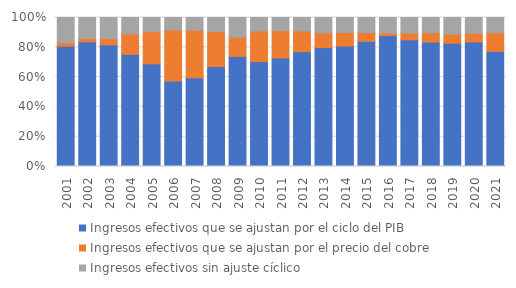
| Category | Ingresos efectivos que se ajustan por el ciclo del PIB | Ingresos efectivos que se ajustan por el precio del cobre | Ingresos efectivos sin ajuste cíclico |
|---|---|---|---|
| 2001.0 | 13692324.184 | 403364.383 | 2868802.818 |
| 2002.0 | 14302150.016 | 376697.313 | 2407610.305 |
| 2003.0 | 14677823.292 | 732809.261 | 2560117.786 |
| 2004.0 | 16267576.217 | 2966535.455 | 2373977.522 |
| 2005.0 | 17740744.154 | 5545301.191 | 2454510.68 |
| 2006.0 | 18202262.007 | 10826611.687 | 2647104.004 |
| 2007.0 | 20811414.936 | 11152453.32 | 2973565.588 |
| 2008.0 | 21223710.508 | 7459659.763 | 2932099.297 |
| 2009.0 | 18594347.247 | 3278429.289 | 3296647.749 |
| 2010.0 | 22741726.065 | 6633690.665 | 2925267.673 |
| 2011.0 | 26246215.561 | 6609539.132 | 3181192.965 |
| 2012.0 | 28135614.977 | 5062476.054 | 3317345.677 |
| 2013.0 | 28740018.355 | 3592203.785 | 3681305.979 |
| 2014.0 | 29552868.606 | 3314423.752 | 3686710.752 |
| 2015.0 | 32289459.156 | 2279864.321 | 3882184.509 |
| 2016.0 | 34128257.891 | 674771.348 | 4069068.16 |
| 2017.0 | 34603044.536 | 1852801.557 | 4232792.438 |
| 2018.0 | 36967451.22 | 2792718.386 | 4528263.675 |
| 2019.0 | 36249183.18 | 2690039.971 | 4885775.912 |
| 2020.0 | 33558116.65 | 2357673.486 | 4234325.358 |
| 2021.0 | 42771245.336 | 6969269.313 | 5634835.887 |